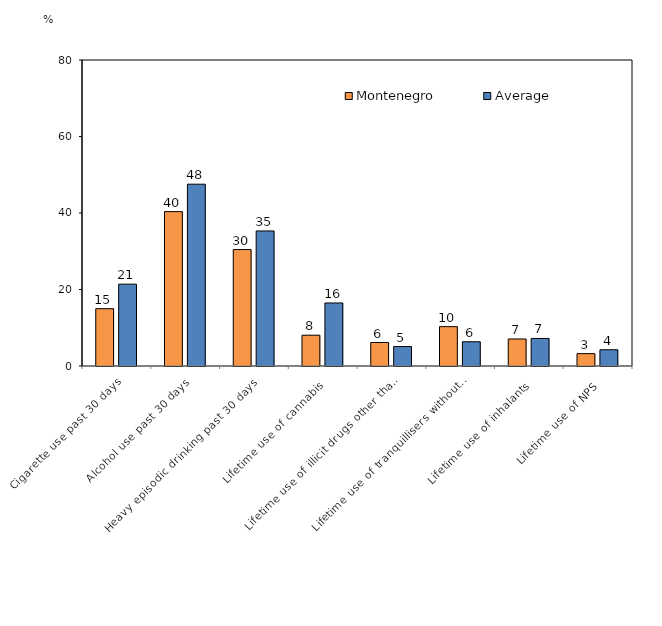
| Category | Montenegro | Average |
|---|---|---|
| Cigarette use past 30 days | 14.98 | 21.397 |
| Alcohol use past 30 days | 40.36 | 47.531 |
| Heavy episodic drinking past 30 days | 30.44 | 35.309 |
| Lifetime use of cannabis | 8.05 | 16.48 |
| Lifetime use of illicit drugs other than cannabis | 6.14 | 5.079 |
| Lifetime use of tranquillisers without prescription  | 10.29 | 6.34 |
| Lifetime use of inhalants | 7.06 | 7.202 |
| Lifetime use of NPS | 3.23 | 4.246 |